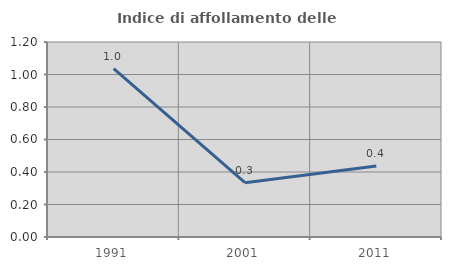
| Category | Indice di affollamento delle abitazioni  |
|---|---|
| 1991.0 | 1.036 |
| 2001.0 | 0.334 |
| 2011.0 | 0.437 |